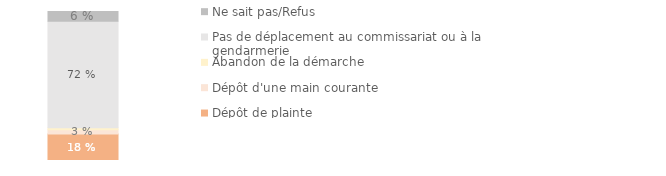
| Category | Dépôt de plainte | Dépôt d'une main courante | Abandon de la démarche | Pas de déplacement au commissariat ou à la gendarmerie | Ne sait pas/Refus |
|---|---|---|---|---|---|
|  | 0.178 | 0.028 | 0.014 | 0.716 | 0.065 |